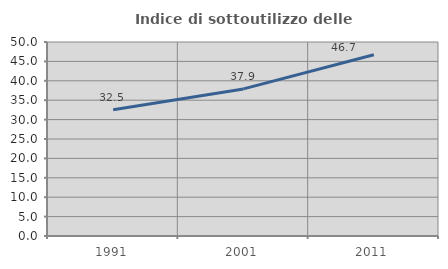
| Category | Indice di sottoutilizzo delle abitazioni  |
|---|---|
| 1991.0 | 32.524 |
| 2001.0 | 37.911 |
| 2011.0 | 46.699 |